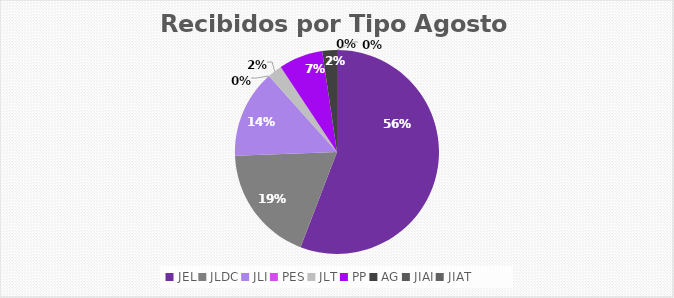
| Category | Series 0 |
|---|---|
| JEL | 24 |
| JLDC | 8 |
| JLI | 6 |
| PES | 0 |
| JLT | 1 |
| PP | 3 |
| AG | 1 |
| JIAI | 0 |
| JIAT | 0 |